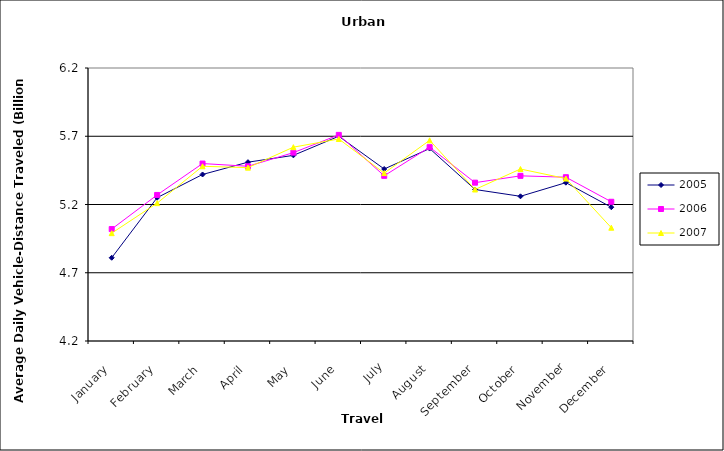
| Category | 2005 | 2006 | 2007 |
|---|---|---|---|
| January | 4.81 | 5.02 | 4.99 |
| February | 5.25 | 5.27 | 5.21 |
| March | 5.42 | 5.5 | 5.48 |
| April | 5.51 | 5.48 | 5.47 |
| May | 5.56 | 5.58 | 5.62 |
| June | 5.7 | 5.71 | 5.68 |
| July | 5.46 | 5.41 | 5.43 |
| August | 5.61 | 5.62 | 5.67 |
| September | 5.31 | 5.36 | 5.31 |
| October | 5.26 | 5.41 | 5.46 |
| November | 5.36 | 5.4 | 5.39 |
| December | 5.18 | 5.22 | 5.03 |